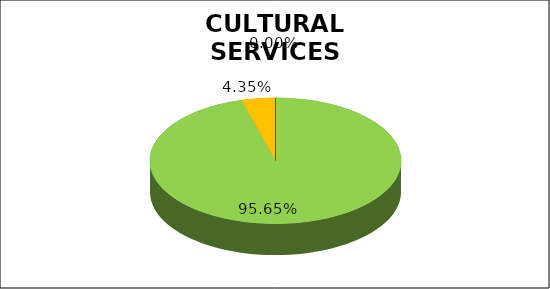
| Category | Series 0 |
|---|---|
| Green | 0.957 |
| Amber | 0.043 |
| Red | 0 |